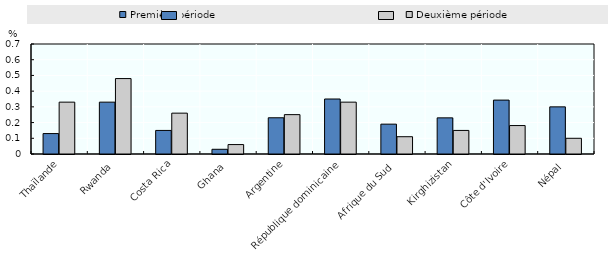
| Category | Première période | Deuxième période |
|---|---|---|
|  Thaïlande | 0.13 | 0.33 |
| Rwanda | 0.33 | 0.48 |
| Costa Rica | 0.15 | 0.26 |
| Ghana | 0.03 | 0.06 |
| Argentine | 0.23 | 0.25 |
| République dominicaine | 0.35 | 0.33 |
| Afrique du Sud | 0.19 | 0.11 |
| Kirghizistan | 0.23 | 0.15 |
| Côte d'Ivoire | 0.343 | 0.181 |
| Népal | 0.3 | 0.1 |